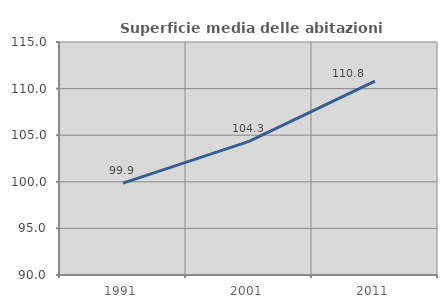
| Category | Superficie media delle abitazioni occupate |
|---|---|
| 1991.0 | 99.86 |
| 2001.0 | 104.336 |
| 2011.0 | 110.803 |